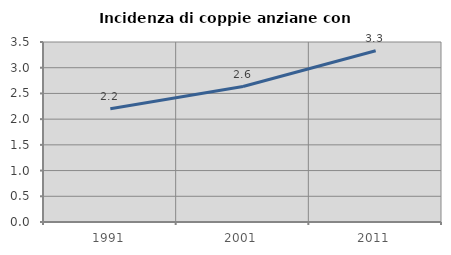
| Category | Incidenza di coppie anziane con figli |
|---|---|
| 1991.0 | 2.203 |
| 2001.0 | 2.634 |
| 2011.0 | 3.33 |